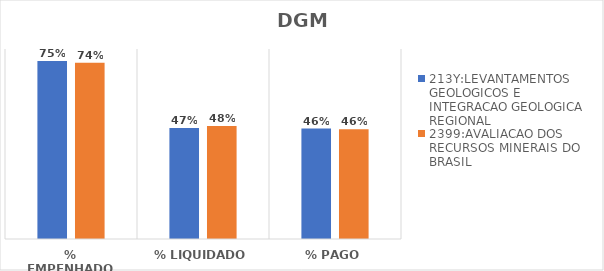
| Category | 213Y:LEVANTAMENTOS GEOLOGICOS E INTEGRACAO GEOLOGICA REGIONAL | 2399:AVALIACAO DOS RECURSOS MINERAIS DO BRASIL |
|---|---|---|
| % EMPENHADO | 0.749 | 0.742 |
| % LIQUIDADO | 0.467 | 0.476 |
| % PAGO | 0.465 | 0.462 |